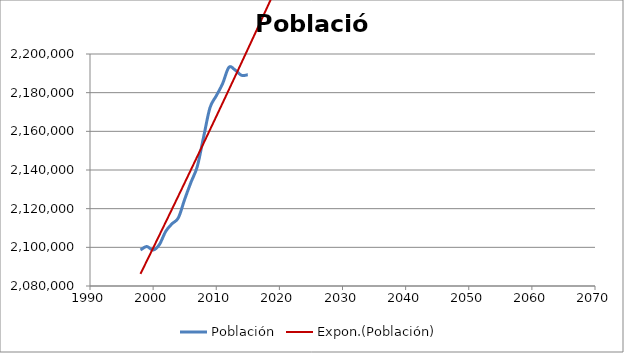
| Category | Población |
|---|---|
| 1998.0 | 2098628 |
| 1999.0 | 2100441 |
| 2000.0 | 2098596 |
| 2001.0 | 2101478 |
| 2002.0 | 2108281 |
| 2003.0 | 2112204 |
| 2004.0 | 2115279 |
| 2005.0 | 2124846 |
| 2006.0 | 2133684 |
| 2007.0 | 2141860 |
| 2008.0 | 2157112 |
| 2009.0 | 2172175 |
| 2010.0 | 2178339 |
| 2011.0 | 2184606 |
| 2012.0 | 2193093 |
| 2013.0 | 2191682 |
| 2014.0 | 2188985 |
| 2015.0 | 2189257 |